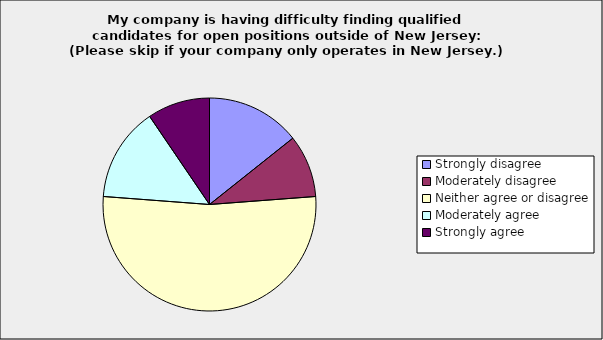
| Category | Series 0 |
|---|---|
| Strongly disagree | 0.143 |
| Moderately disagree | 0.095 |
| Neither agree or disagree | 0.524 |
| Moderately agree | 0.143 |
| Strongly agree | 0.095 |